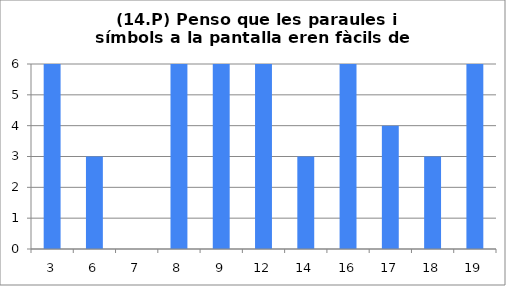
| Category | 14 |
|---|---|
| 3.0 | 6 |
| 6.0 | 3 |
| 7.0 | 0 |
| 8.0 | 6 |
| 9.0 | 6 |
| 12.0 | 6 |
| 14.0 | 3 |
| 16.0 | 6 |
| 17.0 | 4 |
| 18.0 | 3 |
| 19.0 | 6 |